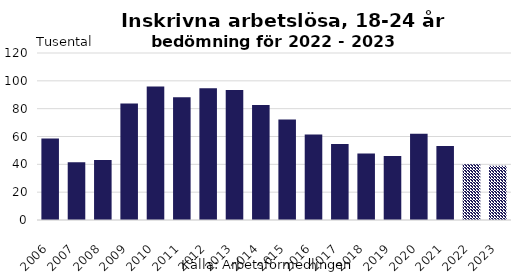
| Category | Inskrivna arbetslösa 18-24 |
|---|---|
| 2006.0 | 58.6 |
| 2007.0 | 41.5 |
| 2008.0 | 43.2 |
| 2009.0 | 83.7 |
| 2010.0 | 96 |
| 2011.0 | 88.2 |
| 2012.0 | 94.6 |
| 2013.0 | 93.5 |
| 2014.0 | 82.7 |
| 2015.0 | 72.2 |
| 2016.0 | 61.5 |
| 2017.0 | 54.6 |
| 2018.0 | 47.8 |
| 2019.0 | 46 |
| 2020.0 | 62 |
| 2021.0 | 53.1 |
| 2022.0 | 40 |
| 2023.0 | 39 |